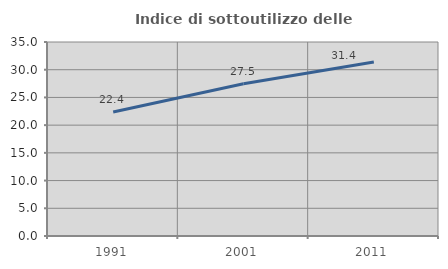
| Category | Indice di sottoutilizzo delle abitazioni  |
|---|---|
| 1991.0 | 22.38 |
| 2001.0 | 27.454 |
| 2011.0 | 31.389 |